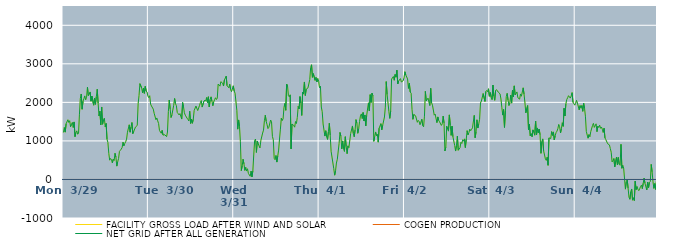
| Category | FACILITY GROSS LOAD AFTER WIND AND SOLAR | COGEN PRODUCTION | NET GRID AFTER ALL GENERATION |
|---|---|---|---|
|  Mon  3/29 | 1219 | 0 | 1219 |
|  Mon  3/29 | 1347 | 0 | 1347 |
|  Mon  3/29 | 1228 | 0 | 1228 |
|  Mon  3/29 | 1444 | 0 | 1444 |
|  Mon  3/29 | 1444 | 0 | 1444 |
|  Mon  3/29 | 1549 | 0 | 1549 |
|  Mon  3/29 | 1479 | 0 | 1479 |
|  Mon  3/29 | 1524 | 0 | 1524 |
|  Mon  3/29 | 1369 | 0 | 1369 |
|  Mon  3/29 | 1429 | 0 | 1429 |
|  Mon  3/29 | 1480 | 0 | 1480 |
|  Mon  3/29 | 1349 | 0 | 1349 |
|  Mon  3/29 | 1492 | 0 | 1492 |
|  Mon  3/29 | 1111 | 0 | 1111 |
|  Mon  3/29 | 1218 | 0 | 1218 |
|  Mon  3/29 | 1261 | 0 | 1261 |
|  Mon  3/29 | 1173 | 0 | 1173 |
|  Mon  3/29 | 1204 | 0 | 1204 |
|  Mon  3/29 | 1694 | 0 | 1694 |
|  Mon  3/29 | 2101 | 0 | 2101 |
|  Mon  3/29 | 2217 | 0 | 2217 |
|  Mon  3/29 | 1822 | 0 | 1822 |
|  Mon  3/29 | 2030 | 0 | 2030 |
|  Mon  3/29 | 2095 | 0 | 2095 |
|  Mon  3/29 | 2168 | 0 | 2168 |
|  Mon  3/29 | 2065 | 0 | 2065 |
|  Mon  3/29 | 2135 | 0 | 2135 |
|  Mon  3/29 | 2392 | 0 | 2392 |
|  Mon  3/29 | 2173 | 0 | 2173 |
|  Mon  3/29 | 2211 | 0 | 2211 |
|  Mon  3/29 | 2270 | 0 | 2270 |
|  Mon  3/29 | 2031 | 0 | 2031 |
|  Mon  3/29 | 2164 | 0 | 2164 |
|  Mon  3/29 | 2141 | 0 | 2141 |
|  Mon  3/29 | 1927 | 0 | 1927 |
|  Mon  3/29 | 2109 | 0 | 2109 |
|  Mon  3/29 | 1949 | 0 | 1949 |
|  Mon  3/29 | 2152 | 0 | 2152 |
|  Mon  3/29 | 2341 | 0 | 2341 |
|  Mon  3/29 | 1982 | 0 | 1982 |
|  Mon  3/29 | 1648 | 0 | 1648 |
|  Mon  3/29 | 1769 | 0 | 1769 |
|  Mon  3/29 | 1416 | 0 | 1416 |
|  Mon  3/29 | 1880 | 0 | 1880 |
|  Mon  3/29 | 1432 | 0 | 1432 |
|  Mon  3/29 | 1542 | 0 | 1542 |
|  Mon  3/29 | 1591 | 0 | 1591 |
|  Mon  3/29 | 1365 | 0 | 1365 |
|  Mon  3/29 | 1453 | 0 | 1453 |
|  Mon  3/29 | 1044 | 0 | 1044 |
|  Mon  3/29 | 958 | 0 | 958 |
|  Mon  3/29 | 678 | 0 | 678 |
|  Mon  3/29 | 500 | 0 | 500 |
|  Mon  3/29 | 544 | 0 | 544 |
|  Mon  3/29 | 517 | 0 | 517 |
|  Mon  3/29 | 431 | 0 | 431 |
|  Mon  3/29 | 525 | 0 | 525 |
|  Mon  3/29 | 492 | 0 | 492 |
|  Mon  3/29 | 679 | 0 | 679 |
|  Mon  3/29 | 578 | 0 | 578 |
|  Mon  3/29 | 346 | 0 | 346 |
|  Mon  3/29 | 460 | 0 | 460 |
|  Mon  3/29 | 543 | 0 | 543 |
|  Mon  3/29 | 729 | 0 | 729 |
|  Mon  3/29 | 757 | 0 | 757 |
|  Mon  3/29 | 787 | 0 | 787 |
|  Mon  3/29 | 829 | 0 | 829 |
|  Mon  3/29 | 966 | 0 | 966 |
|  Mon  3/29 | 872 | 0 | 872 |
|  Mon  3/29 | 936 | 0 | 936 |
|  Mon  3/29 | 980 | 0 | 980 |
|  Mon  3/29 | 1046 | 0 | 1046 |
|  Mon  3/29 | 1225 | 0 | 1225 |
|  Mon  3/29 | 1238 | 0 | 1238 |
|  Mon  3/29 | 1418 | 0 | 1418 |
|  Mon  3/29 | 1226 | 0 | 1226 |
|  Mon  3/29 | 1360 | 0 | 1360 |
|  Mon  3/29 | 1477 | 0 | 1477 |
|  Mon  3/29 | 1189 | 0 | 1189 |
|  Mon  3/29 | 1245 | 0 | 1245 |
|  Mon  3/29 | 1236 | 0 | 1236 |
|  Mon  3/29 | 1360 | 0 | 1360 |
|  Mon  3/29 | 1367 | 0 | 1367 |
|  Mon  3/29 | 1401 | 0 | 1401 |
|  Mon  3/29 | 1962 | 0 | 1962 |
|  Mon  3/29 | 2177 | 0 | 2177 |
|  Mon  3/29 | 2485 | 0 | 2485 |
|  Mon  3/29 | 2467 | 0 | 2467 |
|  Mon  3/29 | 2369 | 0 | 2369 |
|  Mon  3/29 | 2250 | 0 | 2250 |
|  Mon  3/29 | 2366 | 0 | 2366 |
|  Mon  3/29 | 2234 | 0 | 2234 |
|  Mon  3/29 | 2416 | 0 | 2416 |
|  Mon  3/29 | 2295 | 0 | 2295 |
|  Mon  3/29 | 2267 | 0 | 2267 |
|  Mon  3/29 | 2166 | 0 | 2166 |
|  Tue  3/30 | 2122 | 0 | 2122 |
|  Tue  3/30 | 2172 | 0 | 2172 |
|  Tue  3/30 | 1956 | 0 | 1956 |
|  Tue  3/30 | 1906 | 0 | 1906 |
|  Tue  3/30 | 1894 | 0 | 1894 |
|  Tue  3/30 | 1825 | 0 | 1825 |
|  Tue  3/30 | 1718 | 0 | 1718 |
|  Tue  3/30 | 1730 | 0 | 1730 |
|  Tue  3/30 | 1550 | 0 | 1550 |
|  Tue  3/30 | 1595 | 0 | 1595 |
|  Tue  3/30 | 1520 | 0 | 1520 |
|  Tue  3/30 | 1452 | 0 | 1452 |
|  Tue  3/30 | 1271 | 0 | 1271 |
|  Tue  3/30 | 1296 | 0 | 1296 |
|  Tue  3/30 | 1198 | 0 | 1198 |
|  Tue  3/30 | 1274 | 0 | 1274 |
|  Tue  3/30 | 1151 | 0 | 1151 |
|  Tue  3/30 | 1159 | 0 | 1159 |
|  Tue  3/30 | 1159 | 0 | 1159 |
|  Tue  3/30 | 1134 | 0 | 1134 |
|  Tue  3/30 | 1110 | 0 | 1110 |
|  Tue  3/30 | 1231 | 0 | 1231 |
|  Tue  3/30 | 1763 | 0 | 1763 |
|  Tue  3/30 | 2061 | 0 | 2061 |
|  Tue  3/30 | 1830 | 0 | 1830 |
|  Tue  3/30 | 1607 | 0 | 1607 |
|  Tue  3/30 | 1676 | 0 | 1676 |
|  Tue  3/30 | 1685 | 0 | 1685 |
|  Tue  3/30 | 1925 | 0 | 1925 |
|  Tue  3/30 | 2100 | 0 | 2100 |
|  Tue  3/30 | 1967 | 0 | 1967 |
|  Tue  3/30 | 1912 | 0 | 1912 |
|  Tue  3/30 | 1738 | 0 | 1738 |
|  Tue  3/30 | 1708 | 0 | 1708 |
|  Tue  3/30 | 1674 | 0 | 1674 |
|  Tue  3/30 | 1708 | 0 | 1708 |
|  Tue  3/30 | 1684 | 0 | 1684 |
|  Tue  3/30 | 1567 | 0 | 1567 |
|  Tue  3/30 | 1995 | 0 | 1995 |
|  Tue  3/30 | 1886 | 0 | 1886 |
|  Tue  3/30 | 1730 | 0 | 1730 |
|  Tue  3/30 | 1668 | 0 | 1668 |
|  Tue  3/30 | 1648 | 0 | 1648 |
|  Tue  3/30 | 1590 | 0 | 1590 |
|  Tue  3/30 | 1558 | 0 | 1558 |
|  Tue  3/30 | 1518 | 0 | 1518 |
|  Tue  3/30 | 1770 | 0 | 1770 |
|  Tue  3/30 | 1454 | 0 | 1454 |
|  Tue  3/30 | 1563 | 0 | 1563 |
|  Tue  3/30 | 1458 | 0 | 1458 |
|  Tue  3/30 | 1561 | 0 | 1561 |
|  Tue  3/30 | 1788 | 0 | 1788 |
|  Tue  3/30 | 1798 | 0 | 1798 |
|  Tue  3/30 | 1905 | 0 | 1905 |
|  Tue  3/30 | 1920 | 0 | 1920 |
|  Tue  3/30 | 1788 | 0 | 1788 |
|  Tue  3/30 | 1776 | 0 | 1776 |
|  Tue  3/30 | 1915 | 0 | 1915 |
|  Tue  3/30 | 1994 | 0 | 1994 |
|  Tue  3/30 | 2046 | 0 | 2046 |
|  Tue  3/30 | 1878 | 0 | 1878 |
|  Tue  3/30 | 1878 | 0 | 1878 |
|  Tue  3/30 | 2031 | 0 | 2031 |
|  Tue  3/30 | 2059 | 0 | 2059 |
|  Tue  3/30 | 2033 | 0 | 2033 |
|  Tue  3/30 | 2124 | 0 | 2124 |
|  Tue  3/30 | 1997 | 0 | 1997 |
|  Tue  3/30 | 2145 | 0 | 2145 |
|  Tue  3/30 | 1881 | 0 | 1881 |
|  Tue  3/30 | 2071 | 0 | 2071 |
|  Tue  3/30 | 2143 | 0 | 2143 |
|  Tue  3/30 | 2028 | 0 | 2028 |
|  Tue  3/30 | 1913 | 0 | 1913 |
|  Tue  3/30 | 2015 | 0 | 2015 |
|  Tue  3/30 | 2070 | 0 | 2070 |
|  Tue  3/30 | 2119 | 0 | 2119 |
|  Tue  3/30 | 2074 | 0 | 2074 |
|  Tue  3/30 | 2109 | 0 | 2109 |
|  Tue  3/30 | 2474 | 0 | 2474 |
|  Tue  3/30 | 2484 | 0 | 2484 |
|  Tue  3/30 | 2421 | 0 | 2421 |
|  Tue  3/30 | 2536 | 0 | 2536 |
|  Tue  3/30 | 2552 | 0 | 2552 |
|  Tue  3/30 | 2499 | 0 | 2499 |
|  Tue  3/30 | 2424 | 0 | 2424 |
|  Tue  3/30 | 2579 | 0 | 2579 |
|  Tue  3/30 | 2603 | 0 | 2603 |
|  Tue  3/30 | 2680 | 0 | 2680 |
|  Tue  3/30 | 2434 | 0 | 2434 |
|  Tue  3/30 | 2425 | 0 | 2425 |
|  Tue  3/30 | 2378 | 0 | 2378 |
|  Tue  3/30 | 2469 | 0 | 2469 |
|  Tue  3/30 | 2333 | 0 | 2333 |
|  Tue  3/30 | 2277 | 0 | 2277 |
|  Tue  3/30 | 2294 | 0 | 2294 |
|  Tue  3/30 | 2429 | 0 | 2429 |
|  Wed  3/31 | 2296 | 0 | 2296 |
|  Wed  3/31 | 2236 | 0 | 2236 |
|  Wed  3/31 | 2255 | 0 | 2255 |
|  Wed  3/31 | 1795 | 0 | 1795 |
|  Wed  3/31 | 1305 | 0 | 1305 |
|  Wed  3/31 | 1544 | 0 | 1544 |
|  Wed  3/31 | 1371 | 0 | 1371 |
|  Wed  3/31 | 976 | 0 | 976 |
|  Wed  3/31 | 230 | 0 | 230 |
|  Wed  3/31 | 348 | 0 | 348 |
|  Wed  3/31 | 524 | 0 | 524 |
|  Wed  3/31 | 404 | 0 | 404 |
|  Wed  3/31 | 235 | 0 | 235 |
|  Wed  3/31 | 313 | 0 | 313 |
|  Wed  3/31 | 218 | 0 | 218 |
|  Wed  3/31 | 278 | 0 | 278 |
|  Wed  3/31 | 157 | 0 | 157 |
|  Wed  3/31 | 173 | 0 | 173 |
|  Wed  3/31 | 83 | 0 | 83 |
|  Wed  3/31 | 216 | 0 | 216 |
|  Wed  3/31 | 66 | 0 | 66 |
|  Wed  3/31 | 223 | 0 | 223 |
|  Wed  3/31 | 635 | 0 | 635 |
|  Wed  3/31 | 1008 | 0 | 1008 |
|  Wed  3/31 | 1049 | 0 | 1049 |
|  Wed  3/31 | 701 | 0 | 701 |
|  Wed  3/31 | 998 | 0 | 998 |
|  Wed  3/31 | 927 | 0 | 927 |
|  Wed  3/31 | 868 | 0 | 868 |
|  Wed  3/31 | 817 | 0 | 817 |
|  Wed  3/31 | 1012 | 0 | 1012 |
|  Wed  3/31 | 993 | 0 | 993 |
|  Wed  3/31 | 1204 | 0 | 1204 |
|  Wed  3/31 | 1280 | 0 | 1280 |
|  Wed  3/31 | 1525 | 0 | 1525 |
|  Wed  3/31 | 1666 | 0 | 1666 |
|  Wed  3/31 | 1509 | 0 | 1509 |
|  Wed  3/31 | 1419 | 0 | 1419 |
|  Wed  3/31 | 1320 | 0 | 1320 |
|  Wed  3/31 | 1353 | 0 | 1353 |
|  Wed  3/31 | 1337 | 0 | 1337 |
|  Wed  3/31 | 1541 | 0 | 1541 |
|  Wed  3/31 | 1498 | 0 | 1498 |
|  Wed  3/31 | 1117 | 0 | 1117 |
|  Wed  3/31 | 1031 | 0 | 1031 |
|  Wed  3/31 | 547 | 0 | 547 |
|  Wed  3/31 | 512 | 0 | 512 |
|  Wed  3/31 | 621 | 0 | 621 |
|  Wed  3/31 | 451 | 0 | 451 |
|  Wed  3/31 | 605 | 0 | 605 |
|  Wed  3/31 | 762 | 0 | 762 |
|  Wed  3/31 | 1049 | 0 | 1049 |
|  Wed  3/31 | 1306 | 0 | 1306 |
|  Wed  3/31 | 1587 | 0 | 1587 |
|  Wed  3/31 | 1531 | 0 | 1531 |
|  Wed  3/31 | 1572 | 0 | 1572 |
|  Wed  3/31 | 1867 | 0 | 1867 |
|  Wed  3/31 | 1972 | 0 | 1972 |
|  Wed  3/31 | 1795 | 0 | 1795 |
|  Wed  3/31 | 2474 | 0 | 2474 |
|  Wed  3/31 | 2427 | 0 | 2427 |
|  Wed  3/31 | 2171 | 0 | 2171 |
|  Wed  3/31 | 2145 | 0 | 2145 |
|  Wed  3/31 | 2195 | 0 | 2195 |
|  Wed  3/31 | 793 | 0 | 793 |
|  Wed  3/31 | 1438 | 0 | 1438 |
|  Wed  3/31 | 1414 | 0 | 1414 |
|  Wed  3/31 | 1402 | 0 | 1402 |
|  Wed  3/31 | 1356 | 0 | 1356 |
|  Wed  3/31 | 1503 | 0 | 1503 |
|  Wed  3/31 | 1451 | 0 | 1451 |
|  Wed  3/31 | 1610 | 0 | 1610 |
|  Wed  3/31 | 1895 | 0 | 1895 |
|  Wed  3/31 | 1830 | 0 | 1830 |
|  Wed  3/31 | 2150 | 0 | 2150 |
|  Wed  3/31 | 1982 | 0 | 1982 |
|  Wed  3/31 | 1661 | 0 | 1661 |
|  Wed  3/31 | 2267 | 0 | 2267 |
|  Wed  3/31 | 2215 | 0 | 2215 |
|  Wed  3/31 | 2529 | 0 | 2529 |
|  Wed  3/31 | 2179 | 0 | 2179 |
|  Wed  3/31 | 2340 | 0 | 2340 |
|  Wed  3/31 | 2334 | 0 | 2334 |
|  Wed  3/31 | 2376 | 0 | 2376 |
|  Wed  3/31 | 2380 | 0 | 2380 |
|  Wed  3/31 | 2588 | 0 | 2588 |
|  Wed  3/31 | 2901 | 0 | 2901 |
|  Wed  3/31 | 2975 | 0 | 2975 |
|  Wed  3/31 | 2650 | 0 | 2650 |
|  Wed  3/31 | 2747 | 0 | 2747 |
|  Wed  3/31 | 2724 | 0 | 2724 |
|  Wed  3/31 | 2570 | 0 | 2570 |
|  Wed  3/31 | 2650 | 0 | 2650 |
|  Wed  3/31 | 2529 | 0 | 2529 |
|  Wed  3/31 | 2617 | 0 | 2617 |
|  Wed  3/31 | 2549 | 0 | 2549 |
|  Thu  4/1 | 2378 | 0 | 2378 |
|  Thu  4/1 | 2420 | 0 | 2420 |
|  Thu  4/1 | 1879 | 0 | 1879 |
|  Thu  4/1 | 1757 | 0 | 1757 |
|  Thu  4/1 | 1439 | 0 | 1439 |
|  Thu  4/1 | 1435 | 0 | 1435 |
|  Thu  4/1 | 1126 | 0 | 1126 |
|  Thu  4/1 | 1264 | 0 | 1264 |
|  Thu  4/1 | 1107 | 0 | 1107 |
|  Thu  4/1 | 1039 | 0 | 1039 |
|  Thu  4/1 | 1239 | 0 | 1239 |
|  Thu  4/1 | 1458 | 0 | 1458 |
|  Thu  4/1 | 1152 | 0 | 1152 |
|  Thu  4/1 | 731 | 0 | 731 |
|  Thu  4/1 | 581 | 0 | 581 |
|  Thu  4/1 | 564 | 0 | 564 |
|  Thu  4/1 | 280 | 0 | 280 |
|  Thu  4/1 | 111 | 0 | 111 |
|  Thu  4/1 | 224 | 0 | 224 |
|  Thu  4/1 | 426 | 0 | 426 |
|  Thu  4/1 | 525 | 0 | 525 |
|  Thu  4/1 | 545 | 0 | 545 |
|  Thu  4/1 | 935 | 0 | 935 |
|  Thu  4/1 | 1220 | 0 | 1220 |
|  Thu  4/1 | 1123 | 0 | 1123 |
|  Thu  4/1 | 792 | 0 | 792 |
|  Thu  4/1 | 999 | 0 | 999 |
|  Thu  4/1 | 797 | 0 | 797 |
|  Thu  4/1 | 728 | 0 | 728 |
|  Thu  4/1 | 1109 | 0 | 1109 |
|  Thu  4/1 | 853 | 0 | 853 |
|  Thu  4/1 | 670 | 0 | 670 |
|  Thu  4/1 | 872 | 0 | 872 |
|  Thu  4/1 | 824 | 0 | 824 |
|  Thu  4/1 | 802 | 0 | 802 |
|  Thu  4/1 | 1192 | 0 | 1192 |
|  Thu  4/1 | 1209 | 0 | 1209 |
|  Thu  4/1 | 1388 | 0 | 1388 |
|  Thu  4/1 | 1191 | 0 | 1191 |
|  Thu  4/1 | 1108 | 0 | 1108 |
|  Thu  4/1 | 1287 | 0 | 1287 |
|  Thu  4/1 | 1552 | 0 | 1552 |
|  Thu  4/1 | 1456 | 0 | 1456 |
|  Thu  4/1 | 1198 | 0 | 1198 |
|  Thu  4/1 | 1314 | 0 | 1314 |
|  Thu  4/1 | 1504 | 0 | 1504 |
|  Thu  4/1 | 1644 | 0 | 1644 |
|  Thu  4/1 | 1700 | 0 | 1700 |
|  Thu  4/1 | 1580 | 0 | 1580 |
|  Thu  4/1 | 1737 | 0 | 1737 |
|  Thu  4/1 | 1517 | 0 | 1517 |
|  Thu  4/1 | 1673 | 0 | 1673 |
|  Thu  4/1 | 1389 | 0 | 1389 |
|  Thu  4/1 | 1662 | 0 | 1662 |
|  Thu  4/1 | 1676 | 0 | 1676 |
|  Thu  4/1 | 1987 | 0 | 1987 |
|  Thu  4/1 | 1778 | 0 | 1778 |
|  Thu  4/1 | 2200 | 0 | 2200 |
|  Thu  4/1 | 1999 | 0 | 1999 |
|  Thu  4/1 | 2239 | 0 | 2239 |
|  Thu  4/1 | 2175 | 0 | 2175 |
|  Thu  4/1 | 990 | 0 | 990 |
|  Thu  4/1 | 1113 | 0 | 1113 |
|  Thu  4/1 | 1232 | 0 | 1232 |
|  Thu  4/1 | 1136 | 0 | 1136 |
|  Thu  4/1 | 1173 | 0 | 1173 |
|  Thu  4/1 | 967 | 0 | 967 |
|  Thu  4/1 | 1330 | 0 | 1330 |
|  Thu  4/1 | 1338 | 0 | 1338 |
|  Thu  4/1 | 1447 | 0 | 1447 |
|  Thu  4/1 | 1288 | 0 | 1288 |
|  Thu  4/1 | 1405 | 0 | 1405 |
|  Thu  4/1 | 1427 | 0 | 1427 |
|  Thu  4/1 | 1621 | 0 | 1621 |
|  Thu  4/1 | 1876 | 0 | 1876 |
|  Thu  4/1 | 2539 | 0 | 2539 |
|  Thu  4/1 | 2204 | 0 | 2204 |
|  Thu  4/1 | 2222 | 0 | 2222 |
|  Thu  4/1 | 1762 | 0 | 1762 |
|  Thu  4/1 | 1585 | 0 | 1585 |
|  Thu  4/1 | 1774 | 0 | 1774 |
|  Thu  4/1 | 2604 | 0 | 2604 |
|  Thu  4/1 | 2629 | 0 | 2629 |
|  Thu  4/1 | 2670 | 0 | 2670 |
|  Thu  4/1 | 2574 | 0 | 2574 |
|  Thu  4/1 | 2723 | 0 | 2723 |
|  Thu  4/1 | 2655 | 0 | 2655 |
|  Thu  4/1 | 2834 | 0 | 2834 |
|  Thu  4/1 | 2479 | 0 | 2479 |
|  Thu  4/1 | 2556 | 0 | 2556 |
|  Thu  4/1 | 2559 | 0 | 2559 |
|  Thu  4/1 | 2616 | 0 | 2616 |
|  Thu  4/1 | 2529 | 0 | 2529 |
|  Thu  4/1 | 2547 | 0 | 2547 |
|  Thu  4/1 | 2560 | 0 | 2560 |
|  Thu  4/1 | 2635 | 0 | 2635 |
|  Fri  4/2 | 2795 | 0 | 2795 |
|  Fri  4/2 | 2709 | 0 | 2709 |
|  Fri  4/2 | 2700 | 0 | 2700 |
|  Fri  4/2 | 2608 | 0 | 2608 |
|  Fri  4/2 | 2363 | 0 | 2363 |
|  Fri  4/2 | 2494 | 0 | 2494 |
|  Fri  4/2 | 2268 | 0 | 2268 |
|  Fri  4/2 | 2237 | 0 | 2237 |
|  Fri  4/2 | 1819 | 0 | 1819 |
|  Fri  4/2 | 1560 | 0 | 1560 |
|  Fri  4/2 | 1686 | 0 | 1686 |
|  Fri  4/2 | 1663 | 0 | 1663 |
|  Fri  4/2 | 1652 | 0 | 1652 |
|  Fri  4/2 | 1641 | 0 | 1641 |
|  Fri  4/2 | 1483 | 0 | 1483 |
|  Fri  4/2 | 1532 | 0 | 1532 |
|  Fri  4/2 | 1504 | 0 | 1504 |
|  Fri  4/2 | 1420 | 0 | 1420 |
|  Fri  4/2 | 1433 | 0 | 1433 |
|  Fri  4/2 | 1562 | 0 | 1562 |
|  Fri  4/2 | 1399 | 0 | 1399 |
|  Fri  4/2 | 1366 | 0 | 1366 |
|  Fri  4/2 | 1642 | 0 | 1642 |
|  Fri  4/2 | 2285 | 0 | 2285 |
|  Fri  4/2 | 2038 | 0 | 2038 |
|  Fri  4/2 | 2042 | 0 | 2042 |
|  Fri  4/2 | 2110 | 0 | 2110 |
|  Fri  4/2 | 2094 | 0 | 2094 |
|  Fri  4/2 | 1919 | 0 | 1919 |
|  Fri  4/2 | 2363 | 0 | 2363 |
|  Fri  4/2 | 1989 | 0 | 1989 |
|  Fri  4/2 | 1927 | 0 | 1927 |
|  Fri  4/2 | 1932 | 0 | 1932 |
|  Fri  4/2 | 1668 | 0 | 1668 |
|  Fri  4/2 | 1696 | 0 | 1696 |
|  Fri  4/2 | 1684 | 0 | 1684 |
|  Fri  4/2 | 1475 | 0 | 1475 |
|  Fri  4/2 | 1622 | 0 | 1622 |
|  Fri  4/2 | 1531 | 0 | 1531 |
|  Fri  4/2 | 1494 | 0 | 1494 |
|  Fri  4/2 | 1475 | 0 | 1475 |
|  Fri  4/2 | 1402 | 0 | 1402 |
|  Fri  4/2 | 1444 | 0 | 1444 |
|  Fri  4/2 | 1644 | 0 | 1644 |
|  Fri  4/2 | 1466 | 0 | 1466 |
|  Fri  4/2 | 739 | 0 | 739 |
|  Fri  4/2 | 836 | 0 | 836 |
|  Fri  4/2 | 1381 | 0 | 1381 |
|  Fri  4/2 | 1311 | 0 | 1311 |
|  Fri  4/2 | 1254 | 0 | 1254 |
|  Fri  4/2 | 1675 | 0 | 1675 |
|  Fri  4/2 | 1411 | 0 | 1411 |
|  Fri  4/2 | 1144 | 0 | 1144 |
|  Fri  4/2 | 1382 | 0 | 1382 |
|  Fri  4/2 | 1108 | 0 | 1108 |
|  Fri  4/2 | 1114 | 0 | 1114 |
|  Fri  4/2 | 879 | 0 | 879 |
|  Fri  4/2 | 737 | 0 | 737 |
|  Fri  4/2 | 882 | 0 | 882 |
|  Fri  4/2 | 1123 | 0 | 1123 |
|  Fri  4/2 | 757 | 0 | 757 |
|  Fri  4/2 | 732 | 0 | 732 |
|  Fri  4/2 | 824 | 0 | 824 |
|  Fri  4/2 | 965 | 0 | 965 |
|  Fri  4/2 | 933 | 0 | 933 |
|  Fri  4/2 | 1031 | 0 | 1031 |
|  Fri  4/2 | 993 | 0 | 993 |
|  Fri  4/2 | 1052 | 0 | 1052 |
|  Fri  4/2 | 827 | 0 | 827 |
|  Fri  4/2 | 1047 | 0 | 1047 |
|  Fri  4/2 | 1265 | 0 | 1265 |
|  Fri  4/2 | 1156 | 0 | 1156 |
|  Fri  4/2 | 1219 | 0 | 1219 |
|  Fri  4/2 | 1306 | 0 | 1306 |
|  Fri  4/2 | 1264 | 0 | 1264 |
|  Fri  4/2 | 1299 | 0 | 1299 |
|  Fri  4/2 | 1339 | 0 | 1339 |
|  Fri  4/2 | 1330 | 0 | 1330 |
|  Fri  4/2 | 1662 | 0 | 1662 |
|  Fri  4/2 | 1083 | 0 | 1083 |
|  Fri  4/2 | 1235 | 0 | 1235 |
|  Fri  4/2 | 1548 | 0 | 1548 |
|  Fri  4/2 | 1334 | 0 | 1334 |
|  Fri  4/2 | 1435 | 0 | 1435 |
|  Fri  4/2 | 1561 | 0 | 1561 |
|  Fri  4/2 | 1984 | 0 | 1984 |
|  Fri  4/2 | 2034 | 0 | 2034 |
|  Fri  4/2 | 2030 | 0 | 2030 |
|  Fri  4/2 | 2228 | 0 | 2228 |
|  Fri  4/2 | 2216 | 0 | 2216 |
|  Fri  4/2 | 2026 | 0 | 2026 |
|  Fri  4/2 | 2280 | 0 | 2280 |
|  Fri  4/2 | 2309 | 0 | 2309 |
|  Fri  4/2 | 2274 | 0 | 2274 |
|  Fri  4/2 | 2352 | 0 | 2352 |
|  Fri  4/2 | 2158 | 0 | 2158 |
|  Sat  4/3 | 2254 | 0 | 2254 |
|  Sat  4/3 | 2133 | 0 | 2133 |
|  Sat  4/3 | 2072 | 0 | 2072 |
|  Sat  4/3 | 2449 | 0 | 2449 |
|  Sat  4/3 | 2165 | 0 | 2165 |
|  Sat  4/3 | 2054 | 0 | 2054 |
|  Sat  4/3 | 2305 | 0 | 2305 |
|  Sat  4/3 | 2331 | 0 | 2331 |
|  Sat  4/3 | 2297 | 0 | 2297 |
|  Sat  4/3 | 2265 | 0 | 2265 |
|  Sat  4/3 | 2268 | 0 | 2268 |
|  Sat  4/3 | 2220 | 0 | 2220 |
|  Sat  4/3 | 2087 | 0 | 2087 |
|  Sat  4/3 | 1870 | 0 | 1870 |
|  Sat  4/3 | 1670 | 0 | 1670 |
|  Sat  4/3 | 1816 | 0 | 1816 |
|  Sat  4/3 | 1350 | 0 | 1350 |
|  Sat  4/3 | 1775 | 0 | 1775 |
|  Sat  4/3 | 2149 | 0 | 2149 |
|  Sat  4/3 | 2233 | 0 | 2233 |
|  Sat  4/3 | 2056 | 0 | 2056 |
|  Sat  4/3 | 1919 | 0 | 1919 |
|  Sat  4/3 | 1982 | 0 | 1982 |
|  Sat  4/3 | 2187 | 0 | 2187 |
|  Sat  4/3 | 1981 | 0 | 1981 |
|  Sat  4/3 | 2313 | 0 | 2313 |
|  Sat  4/3 | 2139 | 0 | 2139 |
|  Sat  4/3 | 2428 | 0 | 2428 |
|  Sat  4/3 | 2193 | 0 | 2193 |
|  Sat  4/3 | 2188 | 0 | 2188 |
|  Sat  4/3 | 2271 | 0 | 2271 |
|  Sat  4/3 | 2121 | 0 | 2121 |
|  Sat  4/3 | 2122 | 0 | 2122 |
|  Sat  4/3 | 2084 | 0 | 2084 |
|  Sat  4/3 | 2218 | 0 | 2218 |
|  Sat  4/3 | 2159 | 0 | 2159 |
|  Sat  4/3 | 2176 | 0 | 2176 |
|  Sat  4/3 | 2377 | 0 | 2377 |
|  Sat  4/3 | 2210 | 0 | 2210 |
|  Sat  4/3 | 1987 | 0 | 1987 |
|  Sat  4/3 | 1728 | 0 | 1728 |
|  Sat  4/3 | 1714 | 0 | 1714 |
|  Sat  4/3 | 1916 | 0 | 1916 |
|  Sat  4/3 | 1292 | 0 | 1292 |
|  Sat  4/3 | 1431 | 0 | 1431 |
|  Sat  4/3 | 1129 | 0 | 1129 |
|  Sat  4/3 | 1189 | 0 | 1189 |
|  Sat  4/3 | 1106 | 0 | 1106 |
|  Sat  4/3 | 1286 | 0 | 1286 |
|  Sat  4/3 | 1221 | 0 | 1221 |
|  Sat  4/3 | 1148 | 0 | 1148 |
|  Sat  4/3 | 1514 | 0 | 1514 |
|  Sat  4/3 | 1154 | 0 | 1154 |
|  Sat  4/3 | 1336 | 0 | 1336 |
|  Sat  4/3 | 1211 | 0 | 1211 |
|  Sat  4/3 | 1306 | 0 | 1306 |
|  Sat  4/3 | 1160 | 0 | 1160 |
|  Sat  4/3 | 678 | 0 | 678 |
|  Sat  4/3 | 982 | 0 | 982 |
|  Sat  4/3 | 1052 | 0 | 1052 |
|  Sat  4/3 | 742 | 0 | 742 |
|  Sat  4/3 | 761 | 0 | 761 |
|  Sat  4/3 | 533 | 0 | 533 |
|  Sat  4/3 | 494 | 0 | 494 |
|  Sat  4/3 | 577 | 0 | 577 |
|  Sat  4/3 | 367 | 0 | 367 |
|  Sat  4/3 | 1078 | 0 | 1078 |
|  Sat  4/3 | 1085 | 0 | 1085 |
|  Sat  4/3 | 1062 | 0 | 1062 |
|  Sat  4/3 | 1241 | 0 | 1241 |
|  Sat  4/3 | 1144 | 0 | 1144 |
|  Sat  4/3 | 1233 | 0 | 1233 |
|  Sat  4/3 | 1024 | 0 | 1024 |
|  Sat  4/3 | 1135 | 0 | 1135 |
|  Sat  4/3 | 1215 | 0 | 1215 |
|  Sat  4/3 | 1253 | 0 | 1253 |
|  Sat  4/3 | 1315 | 0 | 1315 |
|  Sat  4/3 | 1428 | 0 | 1428 |
|  Sat  4/3 | 1368 | 0 | 1368 |
|  Sat  4/3 | 1207 | 0 | 1207 |
|  Sat  4/3 | 1320 | 0 | 1320 |
|  Sat  4/3 | 1471 | 0 | 1471 |
|  Sat  4/3 | 1378 | 0 | 1378 |
|  Sat  4/3 | 1847 | 0 | 1847 |
|  Sat  4/3 | 1646 | 0 | 1646 |
|  Sat  4/3 | 1956 | 0 | 1956 |
|  Sat  4/3 | 2073 | 0 | 2073 |
|  Sat  4/3 | 2119 | 0 | 2119 |
|  Sat  4/3 | 2173 | 0 | 2173 |
|  Sat  4/3 | 2171 | 0 | 2171 |
|  Sat  4/3 | 2111 | 0 | 2111 |
|  Sat  4/3 | 2166 | 0 | 2166 |
|  Sat  4/3 | 2252 | 0 | 2252 |
|  Sat  4/3 | 2006 | 0 | 2006 |
|  Sat  4/3 | 2013 | 0 | 2013 |
|  Sat  4/3 | 1928 | 0 | 1928 |
|  Sun  4/4 | 1976 | 0 | 1976 |
|  Sun  4/4 | 2052 | 0 | 2052 |
|  Sun  4/4 | 1982 | 0 | 1982 |
|  Sun  4/4 | 1994 | 0 | 1994 |
|  Sun  4/4 | 1807 | 0 | 1807 |
|  Sun  4/4 | 1917 | 0 | 1917 |
|  Sun  4/4 | 1848 | 0 | 1848 |
|  Sun  4/4 | 1918 | 0 | 1918 |
|  Sun  4/4 | 1769 | 0 | 1769 |
|  Sun  4/4 | 1979 | 0 | 1979 |
|  Sun  4/4 | 1850 | 0 | 1850 |
|  Sun  4/4 | 1642 | 0 | 1642 |
|  Sun  4/4 | 1248 | 0 | 1248 |
|  Sun  4/4 | 1153 | 0 | 1153 |
|  Sun  4/4 | 1071 | 0 | 1071 |
|  Sun  4/4 | 1165 | 0 | 1165 |
|  Sun  4/4 | 1106 | 0 | 1106 |
|  Sun  4/4 | 1240 | 0 | 1240 |
|  Sun  4/4 | 1229 | 0 | 1229 |
|  Sun  4/4 | 1401 | 0 | 1401 |
|  Sun  4/4 | 1455 | 0 | 1455 |
|  Sun  4/4 | 1351 | 0 | 1351 |
|  Sun  4/4 | 1344 | 0 | 1344 |
|  Sun  4/4 | 1443 | 0 | 1443 |
|  Sun  4/4 | 1240 | 0 | 1240 |
|  Sun  4/4 | 1383 | 0 | 1383 |
|  Sun  4/4 | 1349 | 0 | 1349 |
|  Sun  4/4 | 1409 | 0 | 1409 |
|  Sun  4/4 | 1327 | 0 | 1327 |
|  Sun  4/4 | 1361 | 0 | 1361 |
|  Sun  4/4 | 1303 | 0 | 1303 |
|  Sun  4/4 | 1221 | 0 | 1221 |
|  Sun  4/4 | 1328 | 0 | 1328 |
|  Sun  4/4 | 1077 | 0 | 1077 |
|  Sun  4/4 | 1032 | 0 | 1032 |
|  Sun  4/4 | 1010 | 0 | 1010 |
|  Sun  4/4 | 927 | 0 | 927 |
|  Sun  4/4 | 919 | 0 | 919 |
|  Sun  4/4 | 896 | 0 | 896 |
|  Sun  4/4 | 801 | 0 | 801 |
|  Sun  4/4 | 706 | 0 | 706 |
|  Sun  4/4 | 455 | 0 | 455 |
|  Sun  4/4 | 489 | 0 | 489 |
|  Sun  4/4 | 542 | 0 | 542 |
|  Sun  4/4 | 327 | 0 | 327 |
|  Sun  4/4 | 306 | 0 | 306 |
|  Sun  4/4 | 581 | 0 | 581 |
|  Sun  4/4 | 380 | 0 | 380 |
|  Sun  4/4 | 570 | 0 | 570 |
|  Sun  4/4 | 395 | 0 | 395 |
|  Sun  4/4 | 367 | 0 | 367 |
|  Sun  4/4 | 911 | 0 | 911 |
|  Sun  4/4 | 290 | 0 | 290 |
|  Sun  4/4 | 365 | 0 | 365 |
|  Sun  4/4 | 296 | 0 | 296 |
|  Sun  4/4 | 306 | 0 | 306 |
|  Sun  4/4 | -251 | 0 | -251 |
|  Sun  4/4 | -60 | 0 | -60 |
|  Sun  4/4 | -4 | 0 | -4 |
|  Sun  4/4 | -230 | 0 | -230 |
|  Sun  4/4 | -460 | 0 | -460 |
|  Sun  4/4 | -514 | 0 | -514 |
|  Sun  4/4 | -319 | 0 | -319 |
|  Sun  4/4 | -247 | 0 | -247 |
|  Sun  4/4 | -537 | 0 | -537 |
|  Sun  4/4 | -475 | 0 | -475 |
|  Sun  4/4 | -549 | 0 | -549 |
|  Sun  4/4 | -44 | 0 | -44 |
|  Sun  4/4 | -264 | 0 | -264 |
|  Sun  4/4 | -184 | 0 | -184 |
|  Sun  4/4 | -252 | 0 | -252 |
|  Sun  4/4 | -291 | 0 | -291 |
|  Sun  4/4 | -247 | 0 | -247 |
|  Sun  4/4 | -182 | 0 | -182 |
|  Sun  4/4 | -148 | 0 | -148 |
|  Sun  4/4 | -238 | 0 | -238 |
|  Sun  4/4 | -101 | 0 | -101 |
|  Sun  4/4 | 35 | 0 | 35 |
|  Sun  4/4 | -101 | 0 | -101 |
|  Sun  4/4 | -104 | 0 | -104 |
|  Sun  4/4 | -273 | 0 | -273 |
|  Sun  4/4 | -69 | 0 | -69 |
|  Sun  4/4 | -211 | 0 | -211 |
|  Sun  4/4 | -76 | 0 | -76 |
|  Sun  4/4 | -50 | 0 | -50 |
|  Sun  4/4 | 390 | 0 | 390 |
|  Sun  4/4 | 199 | 0 | 199 |
|  Sun  4/4 | -56 | 0 | -56 |
|  Sun  4/4 | -232 | 0 | -232 |
|  Sun  4/4 | -107 | 0 | -107 |
|  Sun  4/4 | -258 | 0 | -258 |
|  Sun  4/4 | -22 | 0 | -22 |